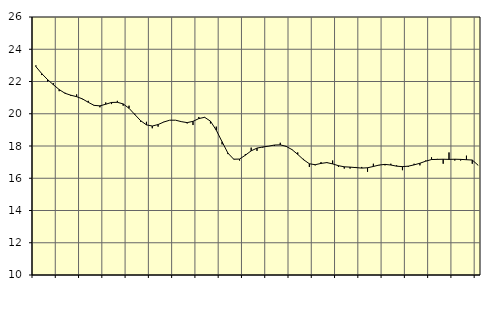
| Category | Piggar | Tillverkning o utvinning, energi o miljö, SNI 05-33, 35-39 |
|---|---|---|
| nan | 23 | 22.92 |
| 1.0 | 22.4 | 22.49 |
| 1.0 | 22 | 22.12 |
| 1.0 | 21.9 | 21.8 |
| nan | 21.4 | 21.5 |
| 2.0 | 21.3 | 21.27 |
| 2.0 | 21.1 | 21.15 |
| 2.0 | 21.2 | 21.06 |
| nan | 20.9 | 20.92 |
| 3.0 | 20.8 | 20.71 |
| 3.0 | 20.5 | 20.52 |
| 3.0 | 20.4 | 20.49 |
| nan | 20.7 | 20.59 |
| 4.0 | 20.6 | 20.7 |
| 4.0 | 20.8 | 20.71 |
| 4.0 | 20.5 | 20.61 |
| nan | 20.5 | 20.34 |
| 5.0 | 20 | 19.95 |
| 5.0 | 19.5 | 19.57 |
| 5.0 | 19.5 | 19.31 |
| nan | 19.1 | 19.24 |
| 6.0 | 19.2 | 19.33 |
| 6.0 | 19.5 | 19.49 |
| 6.0 | 19.6 | 19.6 |
| nan | 19.6 | 19.6 |
| 7.0 | 19.5 | 19.51 |
| 7.0 | 19.4 | 19.45 |
| 7.0 | 19.3 | 19.53 |
| nan | 19.8 | 19.7 |
| 8.0 | 19.8 | 19.78 |
| 8.0 | 19.4 | 19.54 |
| 8.0 | 19.2 | 18.98 |
| nan | 18.1 | 18.26 |
| 9.0 | 17.5 | 17.56 |
| 9.0 | 17.2 | 17.18 |
| 9.0 | 17.1 | 17.19 |
| nan | 17.5 | 17.43 |
| 10.0 | 17.9 | 17.7 |
| 10.0 | 17.7 | 17.87 |
| 10.0 | 17.9 | 17.94 |
| nan | 18 | 17.99 |
| 11.0 | 18 | 18.06 |
| 11.0 | 18.2 | 18.07 |
| 11.0 | 18 | 17.98 |
| nan | 17.8 | 17.78 |
| 12.0 | 17.6 | 17.48 |
| 12.0 | 17.2 | 17.15 |
| 12.0 | 16.7 | 16.9 |
| nan | 16.8 | 16.84 |
| 13.0 | 17 | 16.92 |
| 13.0 | 17 | 16.97 |
| 13.0 | 17.1 | 16.89 |
| nan | 16.7 | 16.78 |
| 14.0 | 16.6 | 16.71 |
| 14.0 | 16.6 | 16.69 |
| 14.0 | 16.7 | 16.66 |
| nan | 16.7 | 16.63 |
| 15.0 | 16.4 | 16.65 |
| 15.0 | 16.9 | 16.73 |
| 15.0 | 16.8 | 16.82 |
| nan | 16.8 | 16.86 |
| 16.0 | 16.9 | 16.82 |
| 16.0 | 16.8 | 16.75 |
| 16.0 | 16.5 | 16.72 |
| nan | 16.7 | 16.75 |
| 17.0 | 16.9 | 16.83 |
| 17.0 | 16.8 | 16.93 |
| 17.0 | 17.1 | 17.06 |
| nan | 17.3 | 17.16 |
| 18.0 | 17.2 | 17.17 |
| 18.0 | 16.9 | 17.18 |
| 18.0 | 17.6 | 17.17 |
| nan | 17.1 | 17.18 |
| 19.0 | 17.1 | 17.17 |
| 19.0 | 17.4 | 17.15 |
| 19.0 | 16.9 | 17.13 |
| nan | 16.8 | 16.81 |